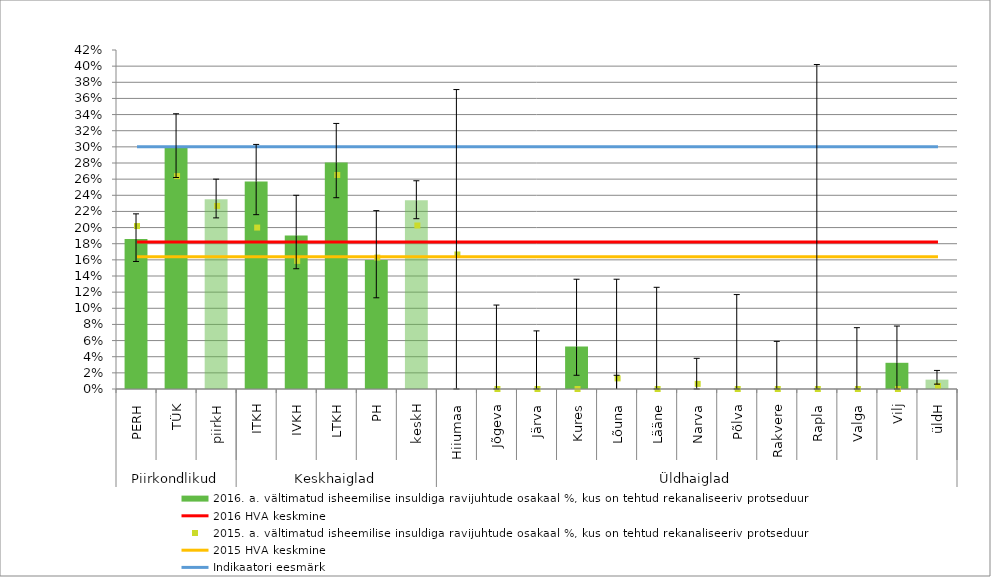
| Category | 2016. a. vältimatud isheemilise insuldiga ravijuhtude osakaal %, kus on tehtud rekanaliseeriv protseduur |
|---|---|
| 0 | 0.186 |
| 1 | 0.3 |
| 2 | 0.235 |
| 3 | 0.257 |
| 4 | 0.19 |
| 5 | 0.281 |
| 6 | 0.16 |
| 7 | 0.234 |
| 8 | 0 |
| 9 | 0 |
| 10 | 0 |
| 11 | 0.053 |
| 12 | 0 |
| 13 | 0 |
| 14 | 0 |
| 15 | 0 |
| 16 | 0 |
| 17 | 0 |
| 18 | 0 |
| 19 | 0.032 |
| 20 | 0.012 |